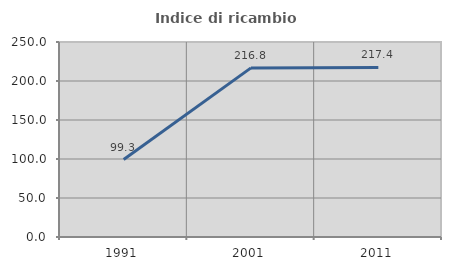
| Category | Indice di ricambio occupazionale  |
|---|---|
| 1991.0 | 99.333 |
| 2001.0 | 216.8 |
| 2011.0 | 217.368 |